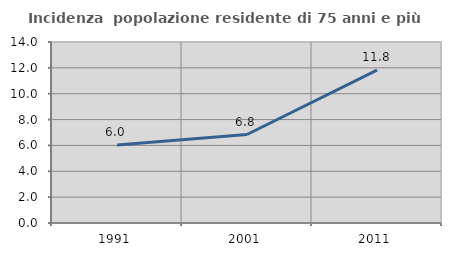
| Category | Incidenza  popolazione residente di 75 anni e più |
|---|---|
| 1991.0 | 6.031 |
| 2001.0 | 6.843 |
| 2011.0 | 11.825 |